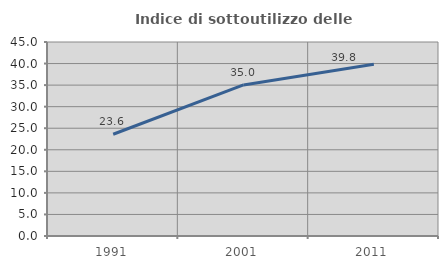
| Category | Indice di sottoutilizzo delle abitazioni  |
|---|---|
| 1991.0 | 23.605 |
| 2001.0 | 35.039 |
| 2011.0 | 39.84 |